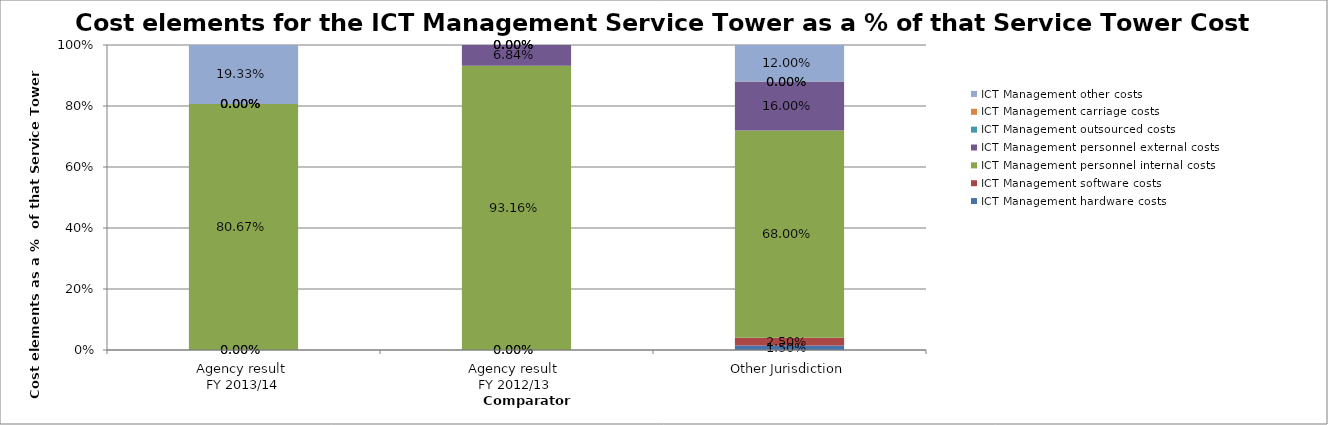
| Category | ICT Management hardware costs | ICT Management software costs | ICT Management personnel internal costs | ICT Management personnel external costs | ICT Management outsourced costs | ICT Management carriage costs | ICT Management other costs |
|---|---|---|---|---|---|---|---|
| Agency result 
FY 2013/14 | 0 | 0 | 0.807 | 0 | 0 | 0 | 0.193 |
| Agency result 
FY 2012/13 | 0 | 0 | 0.932 | 0.068 | 0 | 0 | 0 |
| Other Jurisdiction | 0.015 | 0.025 | 0.68 | 0.16 | 0 | 0 | 0.12 |